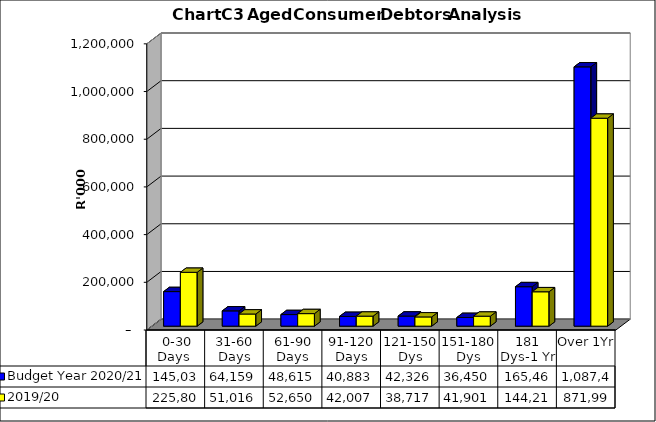
| Category | Budget Year 2020/21 | 2019/20 |
|---|---|---|
|  0-30 Days  | 145038675 | 225807398 |
| 31-60 Days | 64159416 | 51015758 |
| 61-90 Days | 48614503 | 52650277 |
| 91-120 Days | 40882970 | 42007013 |
| 121-150 Dys | 42325710 | 38716756 |
| 151-180 Dys | 36450392 | 41900738 |
| 181 Dys-1 Yr | 165465201 | 144219369 |
| Over 1Yr | 1087439106 | 871990436 |